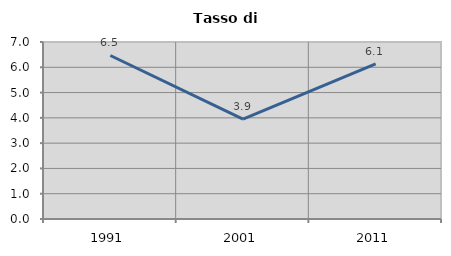
| Category | Tasso di disoccupazione   |
|---|---|
| 1991.0 | 6.467 |
| 2001.0 | 3.95 |
| 2011.0 | 6.137 |